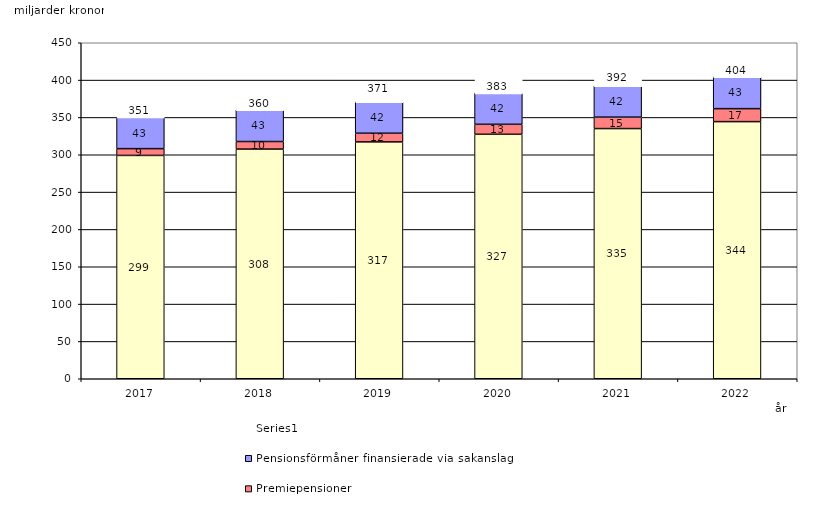
| Category | Inkomstpension och tilläggspension m.m. | Premiepensioner | Pensionsförmåner finansierade via sakanslag | Series 0 |
|---|---|---|---|---|
| 2017.0 | 299.103 | 9.081 | 42.508 | 20 |
| 2018.0 | 307.581 | 10.142 | 42.538 | 20 |
| 2019.0 | 317.221 | 11.629 | 42.109 | 20 |
| 2020.0 | 327.423 | 13.376 | 42.018 | 20 |
| 2021.0 | 335.066 | 15.315 | 42.085 | 20 |
| 2022.0 | 344.347 | 17.389 | 42.638 | 20 |